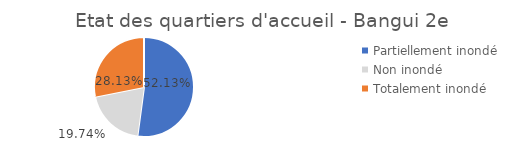
| Category | Individus PDI |
|---|---|
| Partiellement inondé | 0.521 |
| Non inondé | 0.197 |
| Totalement inondé | 0.281 |